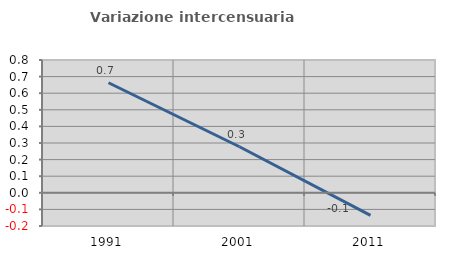
| Category | Variazione intercensuaria annua |
|---|---|
| 1991.0 | 0.663 |
| 2001.0 | 0.278 |
| 2011.0 | -0.136 |